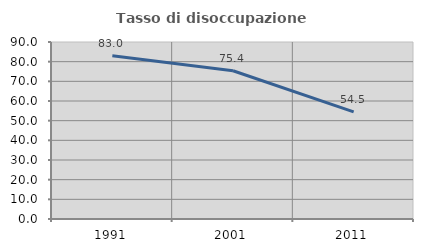
| Category | Tasso di disoccupazione giovanile  |
|---|---|
| 1991.0 | 82.972 |
| 2001.0 | 75.385 |
| 2011.0 | 54.472 |